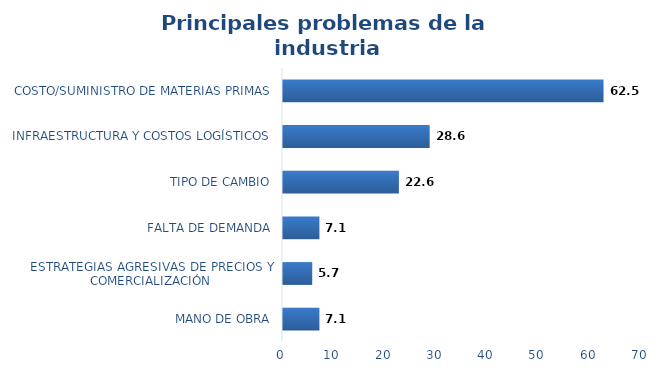
| Category | Series 0 |
|---|---|
| MANO DE OBRA | 7.1 |
| ESTRATEGIAS AGRESIVAS DE PRECIOS Y COMERCIALIZACIÓN | 5.7 |
| FALTA DE DEMANDA | 7.1 |
| TIPO DE CAMBIO | 22.6 |
| INFRAESTRUCTURA Y COSTOS LOGÍSTICOS | 28.6 |
| COSTO/SUMINISTRO DE MATERIAS PRIMAS | 62.5 |